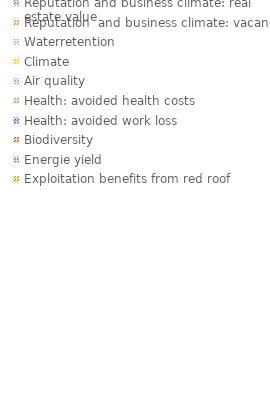
| Category | Series 0 |
|---|---|
| Reputation and business climate: real estate value | 0 |
| Reputation  and business climate: vacancy | 0 |
| Waterretention | 0 |
| Climate | 0 |
| Air quality | 0 |
| Health: avoided health costs | 0 |
| Health: avoided work loss | 0 |
| Biodiversity | 0 |
| Energie yield | 0 |
| Exploitation benefits from red roof | 0 |